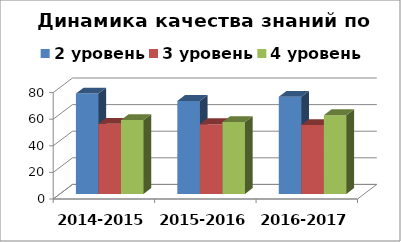
| Category | 2 уровень | 3 уровень | 4 уровень |
|---|---|---|---|
| 2014-2015 | 75.41 | 52.76 | 55.56 |
| 2015-2016 | 69.94 | 52.42 | 54.03 |
| 2016-2017 | 73 | 51.8 | 59.2 |